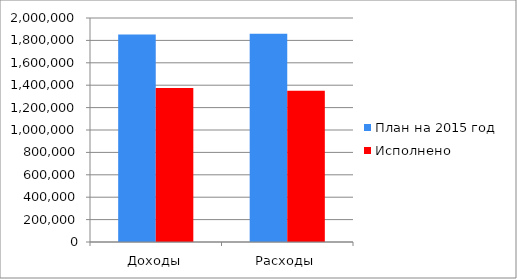
| Category | План на 2015 год | Исполнено  |
|---|---|---|
| Доходы | 1851694 | 1375489 |
| Расходы | 1859012 | 1350658 |